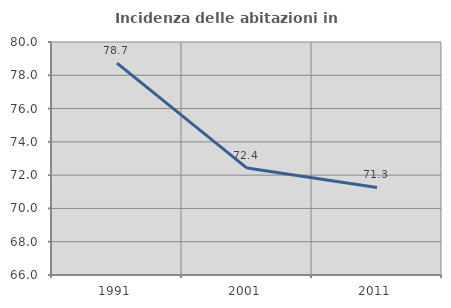
| Category | Incidenza delle abitazioni in proprietà  |
|---|---|
| 1991.0 | 78.731 |
| 2001.0 | 72.424 |
| 2011.0 | 71.263 |